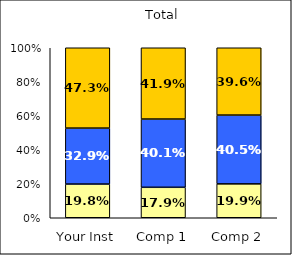
| Category | Low Positive Cross-Racial Interaction | Average Positive Cross-Racial Interaction | High Positive Cross-Racial Interaction |
|---|---|---|---|
| Your Inst | 0.198 | 0.329 | 0.473 |
| Comp 1 | 0.179 | 0.401 | 0.419 |
| Comp 2 | 0.199 | 0.405 | 0.396 |